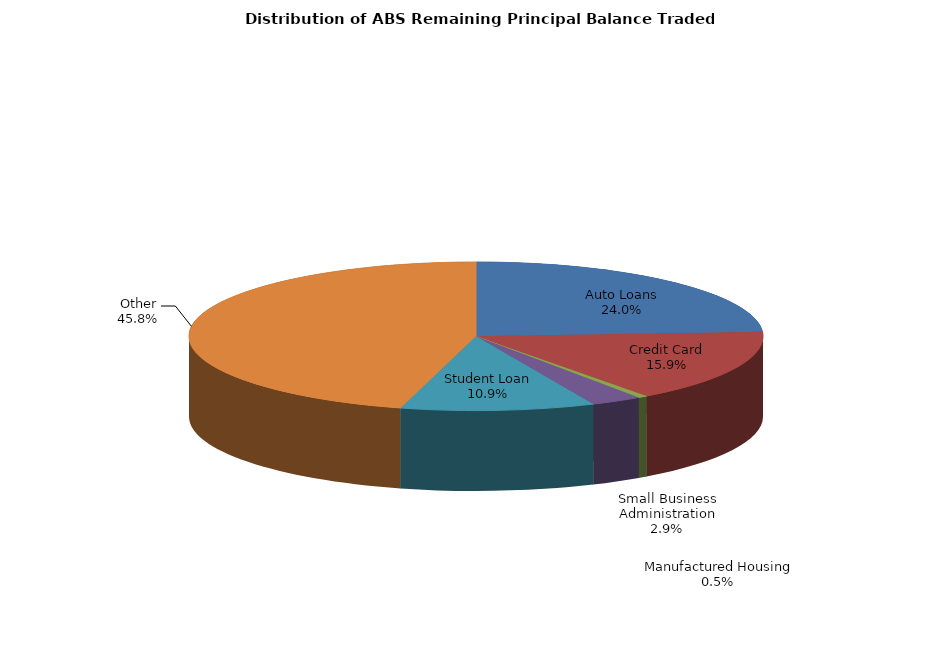
| Category | Series 0 |
|---|---|
| Auto Loans | 564537319.731 |
| Credit Card | 373033974.474 |
| Manufactured Housing | 12511899.262 |
| Small Business Administration | 68081929.302 |
| Student Loan | 256800182.323 |
| Other | 1076141088.741 |